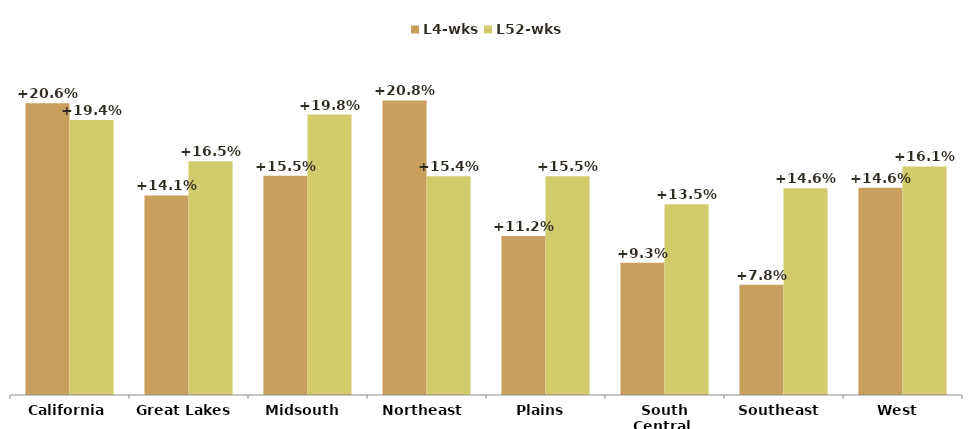
| Category | L4-wks | L52-wks |
|---|---|---|
| California | 0.206 | 0.194 |
| Great Lakes  | 0.141 | 0.165 |
| Midsouth  | 0.155 | 0.198 |
| Northeast  | 0.208 | 0.154 |
| Plains  | 0.112 | 0.155 |
| South Central  | 0.093 | 0.135 |
| Southeast  | 0.078 | 0.146 |
| West  | 0.146 | 0.161 |